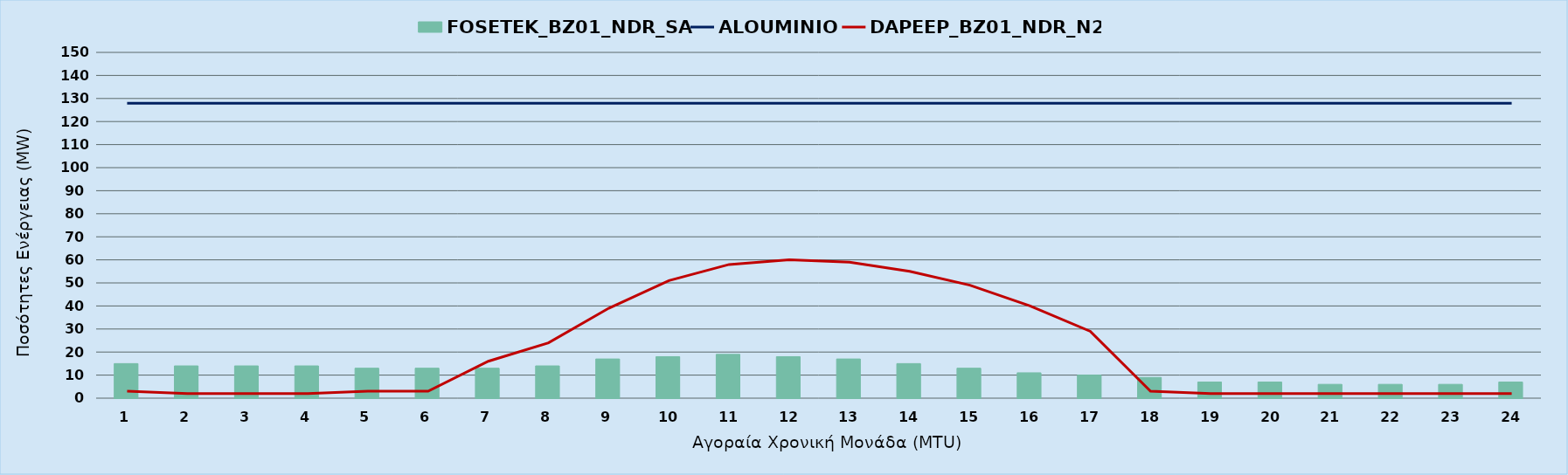
| Category | FOSETEK_BZ01_NDR_SA |
|---|---|
| 0 | 15 |
| 1 | 14 |
| 2 | 14 |
| 3 | 14 |
| 4 | 13 |
| 5 | 13 |
| 6 | 13 |
| 7 | 14 |
| 8 | 17 |
| 9 | 18 |
| 10 | 19 |
| 11 | 18 |
| 12 | 17 |
| 13 | 15 |
| 14 | 13 |
| 15 | 11 |
| 16 | 10 |
| 17 | 9 |
| 18 | 7 |
| 19 | 7 |
| 20 | 6 |
| 21 | 6 |
| 22 | 6 |
| 23 | 7 |